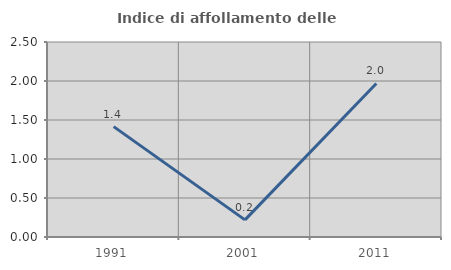
| Category | Indice di affollamento delle abitazioni  |
|---|---|
| 1991.0 | 1.415 |
| 2001.0 | 0.22 |
| 2011.0 | 1.969 |